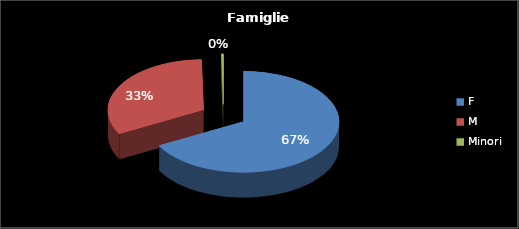
| Category | Series 0 |
|---|---|
| F | 388 |
| M | 188 |
| Minori | 2 |